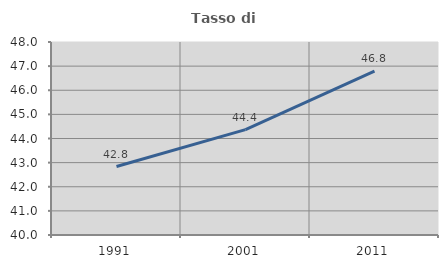
| Category | Tasso di occupazione   |
|---|---|
| 1991.0 | 42.839 |
| 2001.0 | 44.37 |
| 2011.0 | 46.795 |